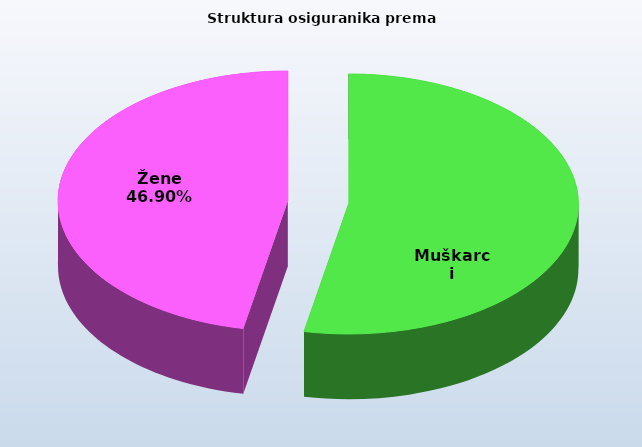
| Category | Series 0 |
|---|---|
| Muškarci | 818633 |
| Žene | 722980 |